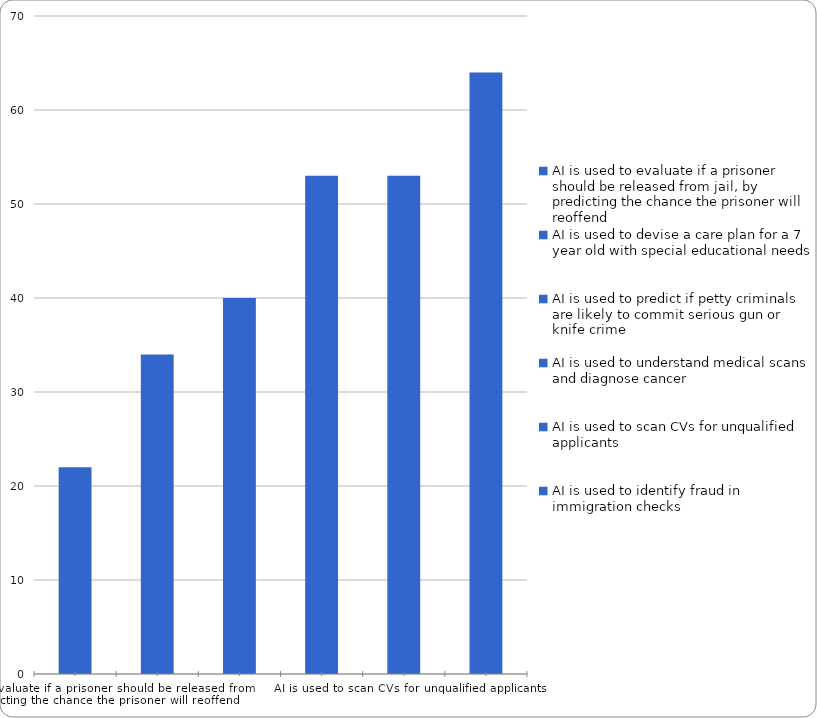
| Category | Series 0 |
|---|---|
| AI is used to evaluate if a prisoner should be released from jail, by predicting the chance the prisoner will reoffend | 22 |
| AI is used to devise a care plan for a 7 year old with special educational needs | 34 |
| AI is used to predict if petty criminals are likely to commit serious gun or knife crime | 40 |
| AI is used to understand medical scans and diagnose cancer | 53 |
| AI is used to scan CVs for unqualified applicants | 53 |
| AI is used to identify fraud in immigration checks | 64 |